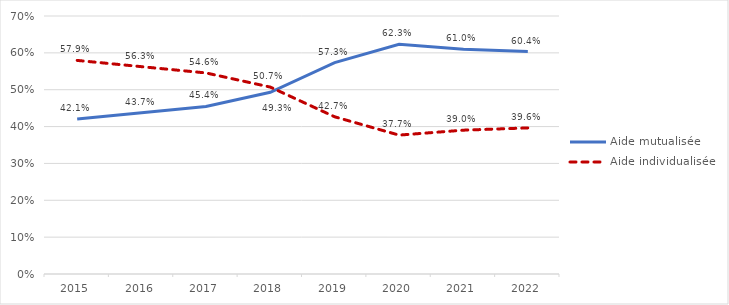
| Category | Aide mutualisée | Aide individualisée |
|---|---|---|
| 2015.0 | 0.421 | 0.579 |
| 2016.0 | 0.437 | 0.563 |
| 2017.0 | 0.454 | 0.546 |
| 2018.0 | 0.493 | 0.507 |
| 2019.0 | 0.573 | 0.427 |
| 2020.0 | 0.623 | 0.377 |
| 2021.0 | 0.61 | 0.39 |
| 2022.0 | 0.604 | 0.396 |